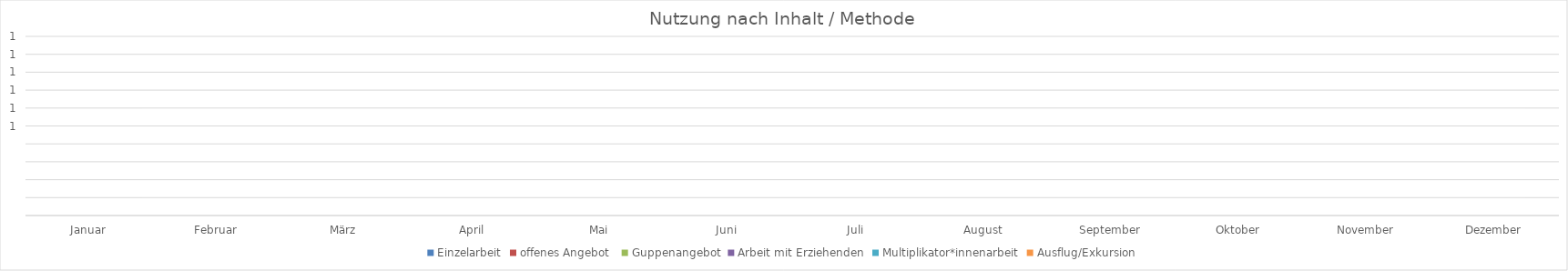
| Category | Einzelarbeit | offenes Angebot  | Guppenangebot | Arbeit mit Erziehenden | Multiplikator*innenarbeit | Ausflug/Exkursion |
|---|---|---|---|---|---|---|
| Januar | 0 | 0 | 0 | 0 | 0 | 0 |
| Februar | 0 | 0 | 0 | 0 | 0 | 0 |
| März | 0 | 0 | 0 | 0 | 0 | 0 |
| April | 0 | 0 | 0 | 0 | 0 | 0 |
| Mai | 0 | 0 | 0 | 0 | 0 | 0 |
| Juni | 0 | 0 | 0 | 0 | 0 | 0 |
| Juli | 0 | 0 | 0 | 0 | 0 | 0 |
| August | 0 | 0 | 0 | 0 | 0 | 0 |
| September | 0 | 0 | 0 | 0 | 0 | 0 |
| Oktober | 0 | 0 | 0 | 0 | 0 | 0 |
| November | 0 | 0 | 0 | 0 | 0 | 0 |
| Dezember | 0 | 0 | 0 | 0 | 0 | 0 |